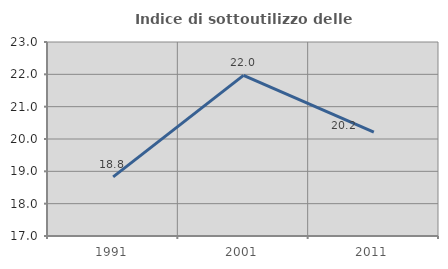
| Category | Indice di sottoutilizzo delle abitazioni  |
|---|---|
| 1991.0 | 18.828 |
| 2001.0 | 21.967 |
| 2011.0 | 20.214 |